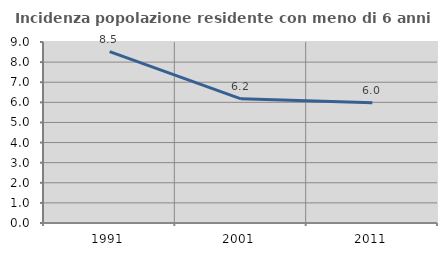
| Category | Incidenza popolazione residente con meno di 6 anni |
|---|---|
| 1991.0 | 8.525 |
| 2001.0 | 6.175 |
| 2011.0 | 5.98 |